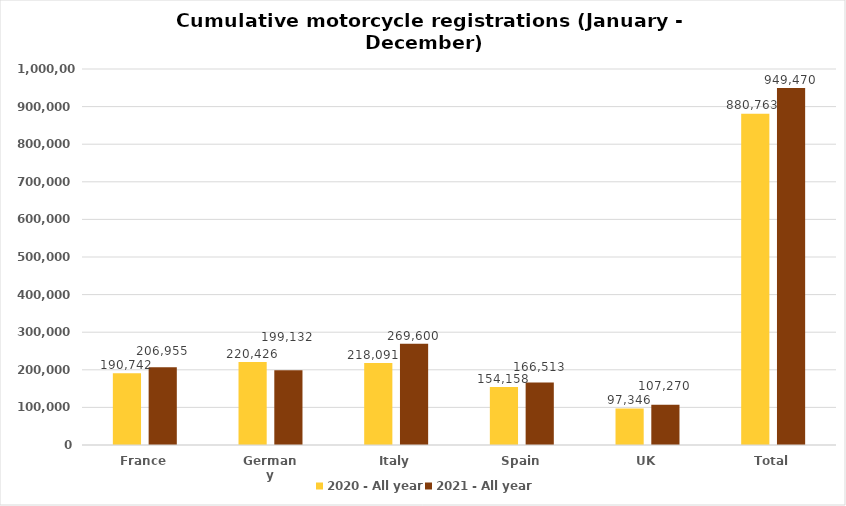
| Category | 2020 - All year | 2021 - All year |
|---|---|---|
| France | 190742 | 206955 |
| Germany | 220426 | 199132 |
| Italy | 218091 | 269600 |
| Spain | 154158 | 166513 |
| UK | 97346 | 107270 |
| Total | 880763 | 949470 |